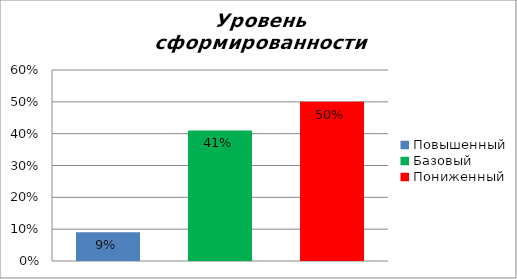
| Category | Уровень сформированности предметных результатов |
|---|---|
| Повышенный | 0.09 |
| Базовый | 0.41 |
| Пониженный | 0.5 |